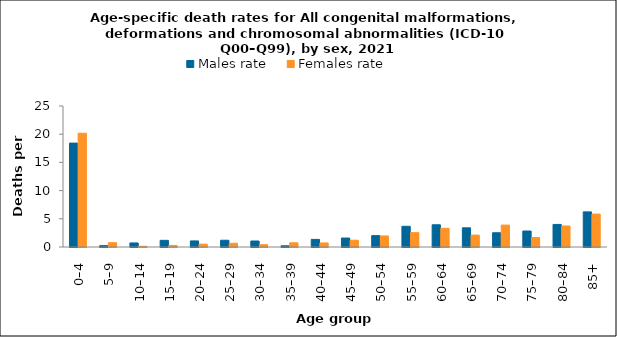
| Category | Males rate | Females rate |
|---|---|---|
| 0–4 | 18.421 | 20.173 |
| 5–9 | 0.241 | 0.764 |
| 10–14 | 0.718 | 0.127 |
| 15–19 | 1.181 | 0.279 |
| 20–24 | 1.075 | 0.509 |
| 25–29 | 1.198 | 0.664 |
| 30–34 | 1.063 | 0.417 |
| 35–39 | 0.215 | 0.745 |
| 40–44 | 1.348 | 0.715 |
| 45–49 | 1.591 | 1.201 |
| 50–54 | 2.015 | 1.957 |
| 55–59 | 3.672 | 2.538 |
| 60–64 | 3.937 | 3.316 |
| 65–69 | 3.401 | 2.113 |
| 70–74 | 2.524 | 3.885 |
| 75–79 | 2.836 | 1.669 |
| 80–84 | 4.001 | 3.723 |
| 85+ | 6.226 | 5.838 |